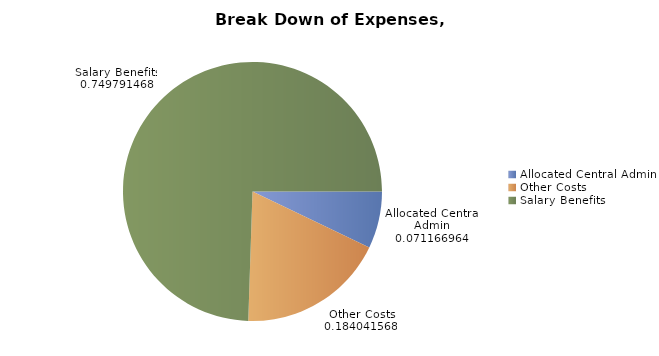
| Category | Total |
|---|---|
| Allocated Central Admin | 33529801.91 |
| Other Costs | 86709857.41 |
| Salary Benefits | 350903128.68 |